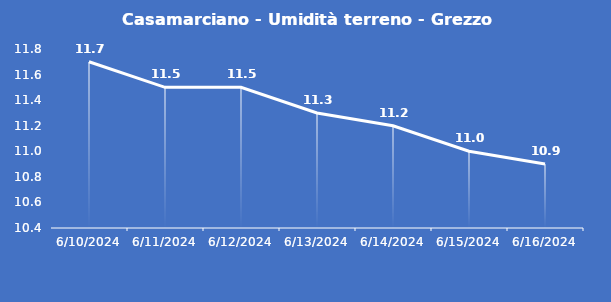
| Category | Casamarciano - Umidità terreno - Grezzo (%VWC) |
|---|---|
| 6/10/24 | 11.7 |
| 6/11/24 | 11.5 |
| 6/12/24 | 11.5 |
| 6/13/24 | 11.3 |
| 6/14/24 | 11.2 |
| 6/15/24 | 11 |
| 6/16/24 | 10.9 |